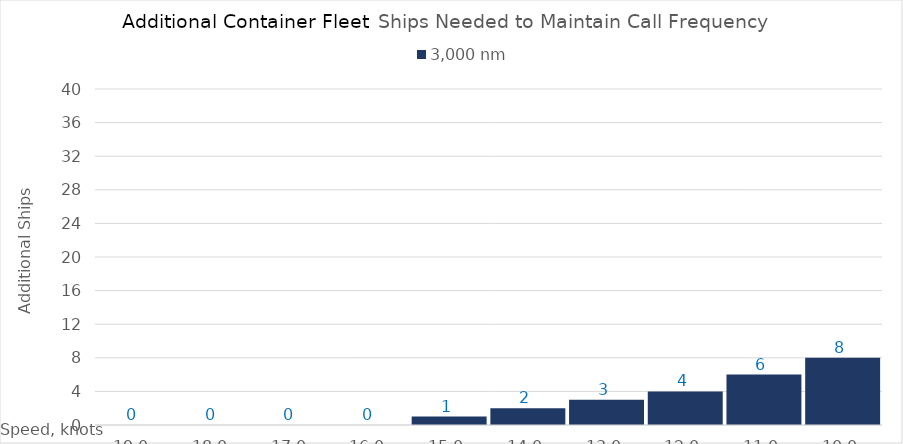
| Category | 3,000 |
|---|---|
| 19.0 | 0 |
| 18.0 | 0 |
| 17.0 | 0 |
| 16.0 | 0 |
| 15.0 | 1 |
| 14.0 | 2 |
| 13.0 | 3 |
| 12.0 | 4 |
| 11.0 | 6 |
| 10.0 | 8 |